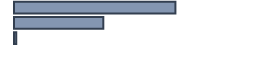
| Category | Series 0 |
|---|---|
| 0 | 63.8 |
| 1 | 35.3 |
| 2 | 0.9 |
| 3 | 0 |